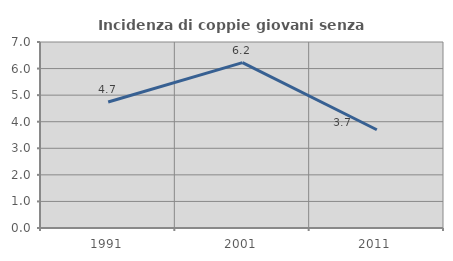
| Category | Incidenza di coppie giovani senza figli |
|---|---|
| 1991.0 | 4.741 |
| 2001.0 | 6.224 |
| 2011.0 | 3.699 |